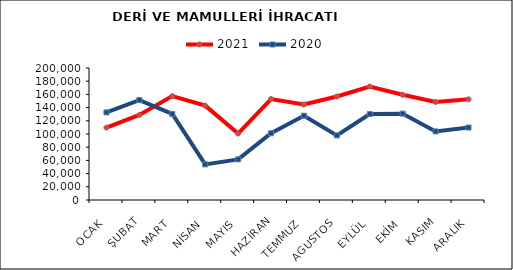
| Category | 2021 | 2020 |
|---|---|---|
| OCAK | 109752.799 | 132734.875 |
| ŞUBAT | 128855.907 | 151363.503 |
| MART | 157434.838 | 130389.913 |
| NİSAN | 142916.447 | 53932.503 |
| MAYIS | 100680.885 | 61556.32 |
| HAZİRAN | 152987.597 | 101137.992 |
| TEMMUZ | 144668.513 | 127734.831 |
| AGUSTOS | 156818.722 | 97893.038 |
| EYLÜL | 171897.177 | 130330.876 |
| EKİM | 159402.294 | 130846.057 |
| KASIM | 148511.877 | 103914.368 |
| ARALIK | 152535.244 | 109800.353 |